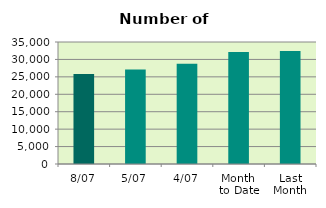
| Category | Series 0 |
|---|---|
| 8/07 | 25822 |
| 5/07 | 27076 |
| 4/07 | 28774 |
| Month 
to Date | 32106.667 |
| Last
Month | 32421.5 |